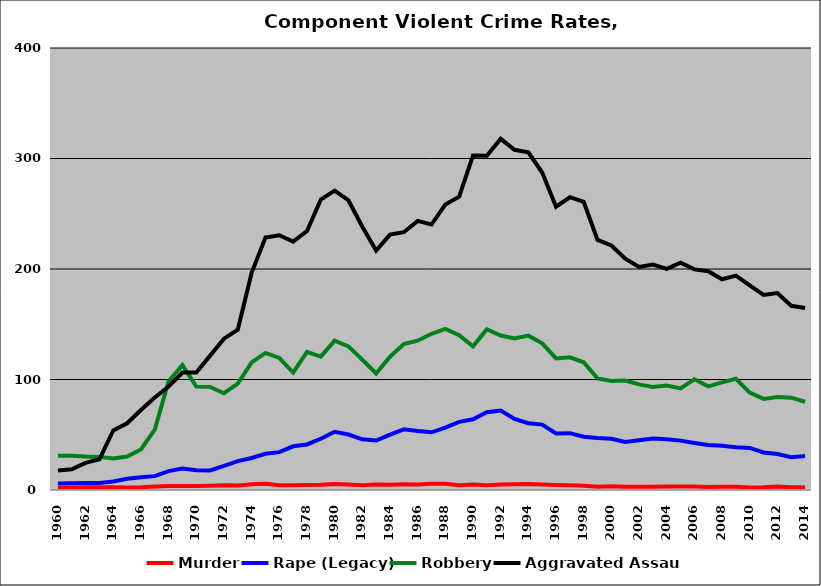
| Category | Murder | Rape (Legacy) | Robbery | Aggravated Assault |
|---|---|---|---|---|
| 1960.0 | 2.138 | 5.818 | 31.053 | 17.629 |
| 1961.0 | 2.171 | 6.203 | 31.082 | 18.677 |
| 1962.0 | 2.462 | 6.287 | 30.339 | 24.551 |
| 1963.0 | 2.492 | 6.426 | 29.967 | 27.803 |
| 1964.0 | 2.413 | 7.674 | 28.485 | 53.954 |
| 1965.0 | 2.241 | 10.167 | 30.268 | 60.368 |
| 1966.0 | 2.517 | 11.611 | 36.711 | 72.416 |
| 1967.0 | 3.11 | 12.536 | 54.616 | 83.738 |
| 1968.0 | 3.602 | 17.125 | 98.382 | 93.651 |
| 1969.0 | 3.645 | 19.4 | 112.992 | 106.261 |
| 1970.0 | 3.52 | 17.981 | 93.542 | 106.302 |
| 1971.0 | 3.769 | 17.744 | 93.331 | 121.6 |
| 1972.0 | 4.24 | 21.754 | 87.598 | 136.974 |
| 1973.0 | 3.995 | 26.159 | 96.296 | 145.028 |
| 1974.0 | 5.15 | 28.999 | 115.506 | 196.605 |
| 1975.0 | 5.7 | 32.731 | 124.012 | 228.386 |
| 1976.0 | 4.264 | 34.275 | 119.518 | 230.537 |
| 1977.0 | 4.347 | 39.557 | 106.233 | 224.768 |
| 1978.0 | 4.637 | 41.229 | 125.04 | 234.393 |
| 1979.0 | 4.763 | 46.383 | 120.708 | 262.787 |
| 1980.0 | 5.47 | 52.731 | 135.122 | 270.973 |
| 1981.0 | 5.057 | 50.214 | 129.986 | 262.013 |
| 1982.0 | 4.358 | 45.866 | 117.856 | 238.304 |
| 1983.0 | 4.93 | 44.721 | 105.419 | 216.698 |
| 1984.0 | 4.645 | 50.034 | 120.648 | 231.111 |
| 1985.0 | 5.239 | 54.888 | 132.025 | 233.273 |
| 1986.0 | 4.997 | 53.372 | 135.133 | 243.536 |
| 1987.0 | 5.641 | 52.226 | 141.406 | 240.238 |
| 1988.0 | 5.716 | 56.527 | 145.876 | 258.281 |
| 1989.0 | 4.39 | 61.71 | 140.139 | 265.511 |
| 1990.0 | 4.89 | 64.007 | 129.986 | 302.69 |
| 1991.0 | 4.205 | 70.327 | 145.536 | 302.531 |
| 1992.0 | 5.023 | 71.982 | 139.759 | 317.776 |
| 1993.0 | 5.157 | 64.396 | 137.088 | 307.916 |
| 1994.0 | 5.503 | 60.453 | 139.697 | 305.615 |
| 1995.0 | 5.064 | 59.179 | 132.738 | 287.277 |
| 1996.0 | 4.609 | 51.112 | 119.049 | 256.407 |
| 1997.0 | 4.349 | 51.426 | 120.036 | 264.955 |
| 1998.0 | 3.937 | 48.163 | 115.609 | 260.837 |
| 1999.0 | 2.971 | 47.096 | 100.897 | 226.289 |
| 2000.0 | 3.325 | 46.436 | 98.607 | 221.288 |
| 2001.0 | 2.987 | 43.381 | 99.009 | 209.314 |
| 2002.0 | 3.033 | 45.063 | 95.549 | 201.894 |
| 2003.0 | 2.968 | 46.695 | 93.259 | 204.019 |
| 2004.0 | 3.061 | 46.028 | 94.506 | 200.047 |
| 2005.0 | 3.258 | 44.676 | 91.991 | 205.677 |
| 2006.0 | 3.08 | 42.575 | 100.222 | 199.662 |
| 2007.0 | 2.69 | 40.752 | 93.84 | 197.931 |
| 2008.0 | 2.939 | 40.009 | 97.425 | 190.708 |
| 2009.0 | 2.851 | 38.759 | 100.702 | 193.992 |
| 2010.0 | 2.26 | 38.099 | 88.17 | 185.262 |
| 2011.0 | 2.389 | 34.001 | 82.468 | 176.484 |
| 2012.0 | 3.147 | 32.631 | 84.13 | 178.164 |
| 2013.0 | 2.395 | 29.711 | 83.585 | 166.668 |
| 2014.0 | 2.464 | 30.744 | 79.869 | 164.653 |